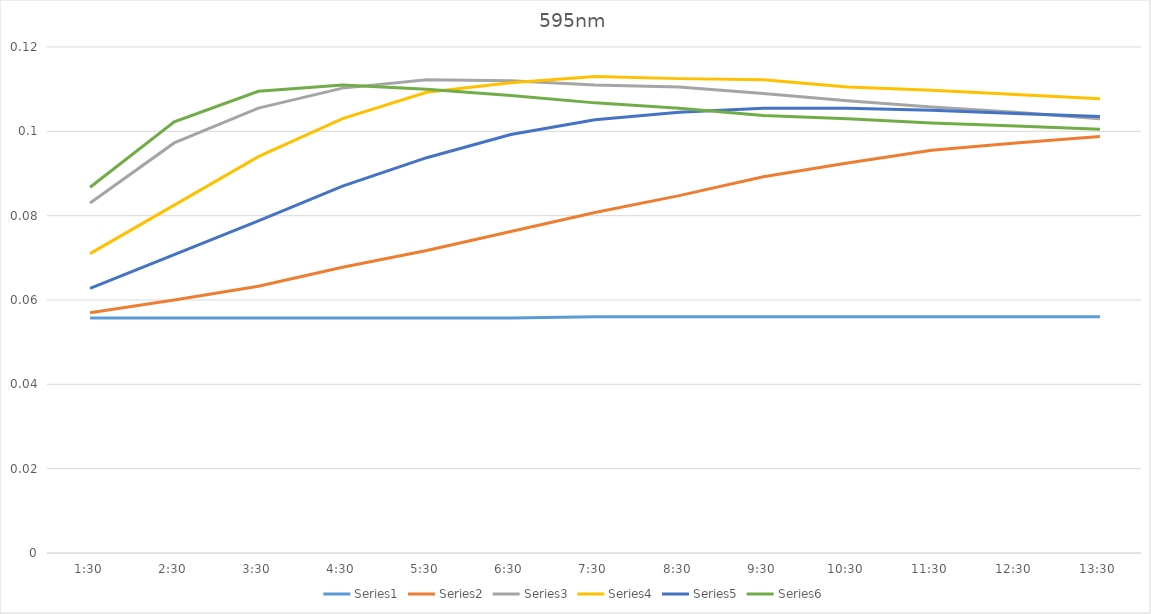
| Category | Series 0 | Series 1 | Series 2 | Series 3 | Series 4 | Series 5 |
|---|---|---|---|---|---|---|
| 0.0625 | 0.056 | 0.057 | 0.083 | 0.071 | 0.063 | 0.087 |
| 0.104166666666667 | 0.056 | 0.06 | 0.097 | 0.082 | 0.071 | 0.102 |
| 0.145833333333333 | 0.056 | 0.063 | 0.106 | 0.094 | 0.079 | 0.11 |
| 0.1875 | 0.056 | 0.068 | 0.11 | 0.103 | 0.087 | 0.111 |
| 0.229166666666667 | 0.056 | 0.072 | 0.112 | 0.109 | 0.094 | 0.11 |
| 0.270833333333333 | 0.056 | 0.076 | 0.112 | 0.112 | 0.099 | 0.108 |
| 0.3125 | 0.056 | 0.081 | 0.111 | 0.113 | 0.103 | 0.107 |
| 0.354166666666667 | 0.056 | 0.085 | 0.11 | 0.112 | 0.104 | 0.106 |
| 0.395833333333333 | 0.056 | 0.089 | 0.109 | 0.112 | 0.106 | 0.104 |
| 0.4375 | 0.056 | 0.092 | 0.107 | 0.11 | 0.106 | 0.103 |
| 0.479166666666667 | 0.056 | 0.096 | 0.106 | 0.11 | 0.105 | 0.102 |
| 0.520833333333333 | 0.056 | 0.097 | 0.104 | 0.109 | 0.104 | 0.101 |
| 0.5625 | 0.056 | 0.099 | 0.103 | 0.108 | 0.104 | 0.1 |